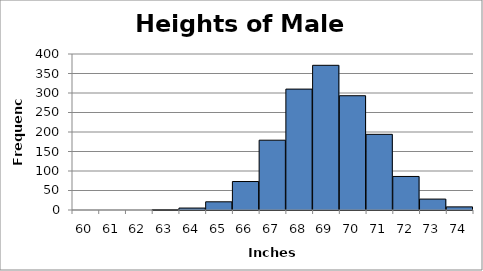
| Category | Series 0 |
|---|---|
| 60.0 | 0 |
| 61.0 | 0 |
| 62.0 | 0 |
| 63.0 | 1 |
| 64.0 | 5 |
| 65.0 | 21 |
| 66.0 | 73 |
| 67.0 | 179 |
| 68.0 | 310 |
| 69.0 | 371 |
| 70.0 | 293 |
| 71.0 | 194 |
| 72.0 | 86 |
| 73.0 | 28 |
| 74.0 | 8 |